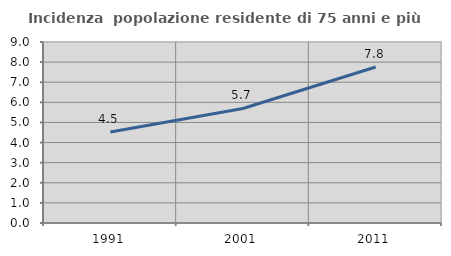
| Category | Incidenza  popolazione residente di 75 anni e più |
|---|---|
| 1991.0 | 4.521 |
| 2001.0 | 5.696 |
| 2011.0 | 7.756 |